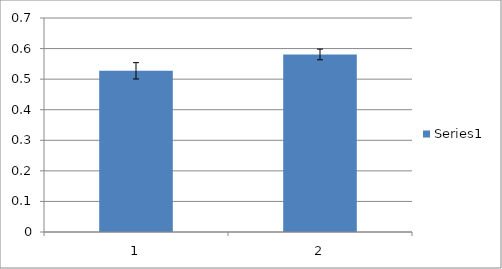
| Category | Series 0 |
|---|---|
| 0 | 0.527 |
| 1 | 0.581 |